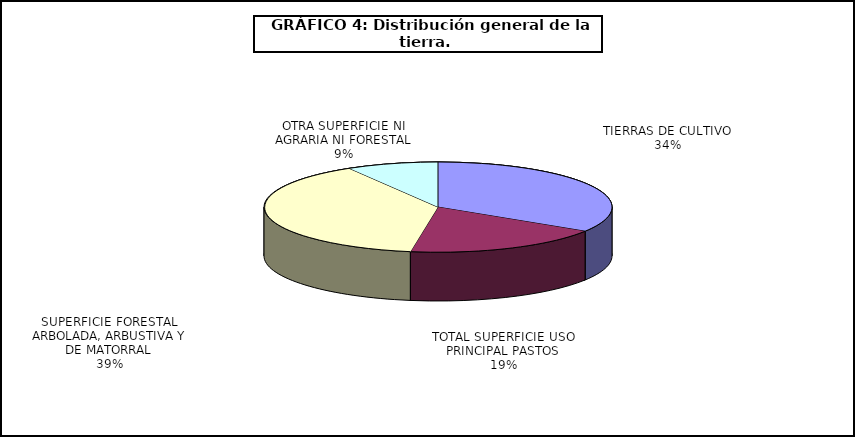
| Category | Series 0 |
|---|---|
| TIERRAS DE CULTIVO | 17187885 |
| TOTAL SUPERFICIE USO PRINCIPAL PASTOS | 9390014 |
| SUPERFICIE FORESTAL ARBOLADA, ARBUSTIVA Y DE MATORRAL | 19699771 |
| OTRA SUPERFICIE NI AGRARIA NI FORESTAL | 4315874 |